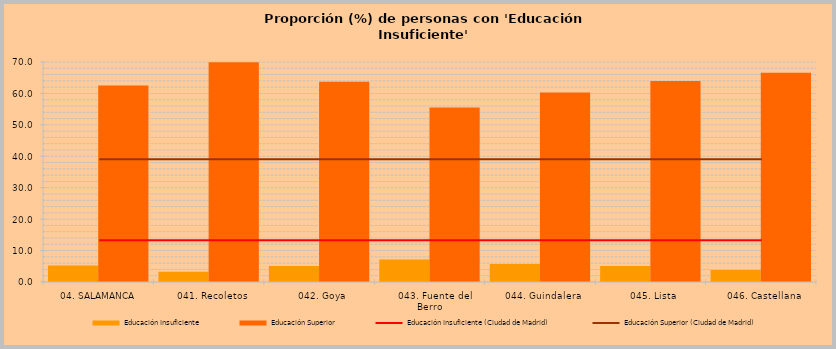
| Category | Educación Insuficiente | Educación Superior |
|---|---|---|
|  04. SALAMANCA | 5.242 | 62.524 |
|    041. Recoletos | 3.292 | 69.934 |
|    042. Goya | 5.072 | 63.72 |
|    043. Fuente del Berro | 7.169 | 55.505 |
|    044. Guindalera | 5.706 | 60.285 |
|    045. Lista | 5.098 | 63.932 |
|    046. Castellana | 3.841 | 66.559 |